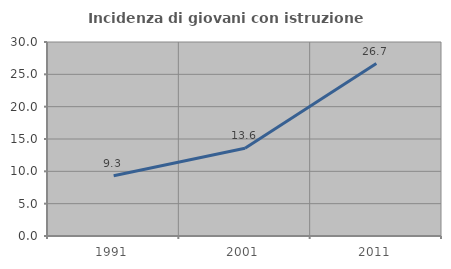
| Category | Incidenza di giovani con istruzione universitaria |
|---|---|
| 1991.0 | 9.314 |
| 2001.0 | 13.571 |
| 2011.0 | 26.667 |